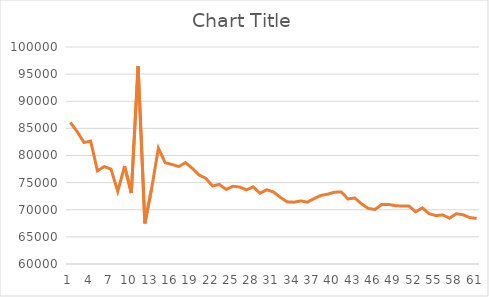
| Category | Series 0 |
|---|---|
| 0 | 86072.715 |
| 1 | 84414.492 |
| 2 | 82407.22 |
| 3 | 82641.118 |
| 4 | 77166.59 |
| 5 | 77959.845 |
| 6 | 77483.437 |
| 7 | 73373.584 |
| 8 | 78033.229 |
| 9 | 73084.466 |
| 10 | 96501.4 |
| 11 | 67484.912 |
| 12 | 73913.091 |
| 13 | 81342.22 |
| 14 | 78661.486 |
| 15 | 78352.421 |
| 16 | 77964.759 |
| 17 | 78684.151 |
| 18 | 77639.076 |
| 19 | 76420.487 |
| 20 | 75795.118 |
| 21 | 74374.603 |
| 22 | 74682.804 |
| 23 | 73738.978 |
| 24 | 74328.041 |
| 25 | 74179.462 |
| 26 | 73658.256 |
| 27 | 74219.083 |
| 28 | 73043.668 |
| 29 | 73684.783 |
| 30 | 73273.365 |
| 31 | 72293.446 |
| 32 | 71459.897 |
| 33 | 71393.248 |
| 34 | 71619.581 |
| 35 | 71407.287 |
| 36 | 72053.066 |
| 37 | 72638.87 |
| 38 | 72870.904 |
| 39 | 73238.585 |
| 40 | 73270.231 |
| 41 | 72003.471 |
| 42 | 72157.41 |
| 43 | 71104.669 |
| 44 | 70235.425 |
| 45 | 70055.389 |
| 46 | 70982.041 |
| 47 | 70987.567 |
| 48 | 70743.841 |
| 49 | 70688.426 |
| 50 | 70682.183 |
| 51 | 69617.676 |
| 52 | 70342.487 |
| 53 | 69256.712 |
| 54 | 68926.327 |
| 55 | 69042.188 |
| 56 | 68444.786 |
| 57 | 69257.266 |
| 58 | 69075.196 |
| 59 | 68549.275 |
| 60 | 68411.79 |